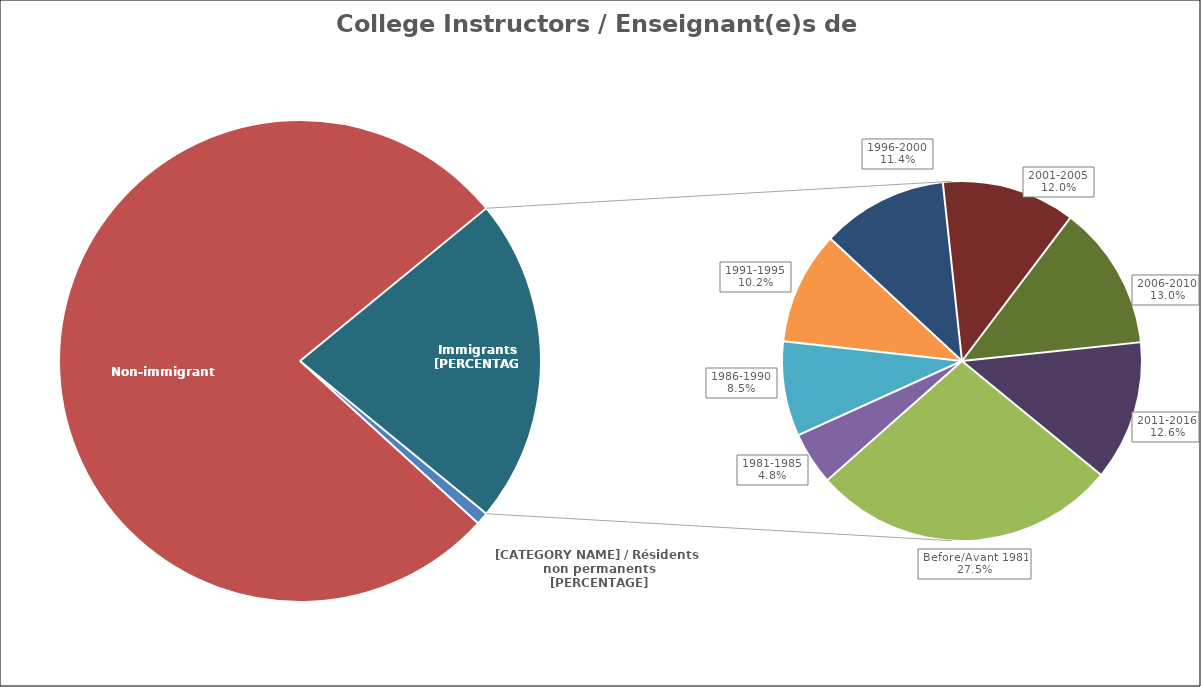
| Category | Series 0 |
|---|---|
|   Non-permanent residents | 820 |
|   Non-immigrants | 75720 |
|     Before 1981 | 5895 |
|     1981 to 1985 | 1020 |
|     1986 to 1990 | 1825 |
|     1991 to 1995 | 2175 |
|     1996 to 2000 | 2435 |
|     2001 to 2005 | 2570 |
|     2006 to 2010 | 2790 |
|     2011 to 2016 | 2695 |